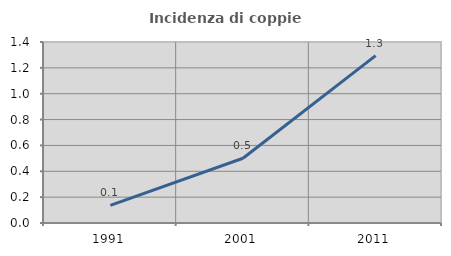
| Category | Incidenza di coppie miste |
|---|---|
| 1991.0 | 0.137 |
| 2001.0 | 0.501 |
| 2011.0 | 1.294 |